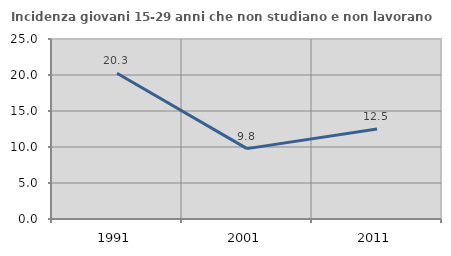
| Category | Incidenza giovani 15-29 anni che non studiano e non lavorano  |
|---|---|
| 1991.0 | 20.253 |
| 2001.0 | 9.774 |
| 2011.0 | 12.5 |